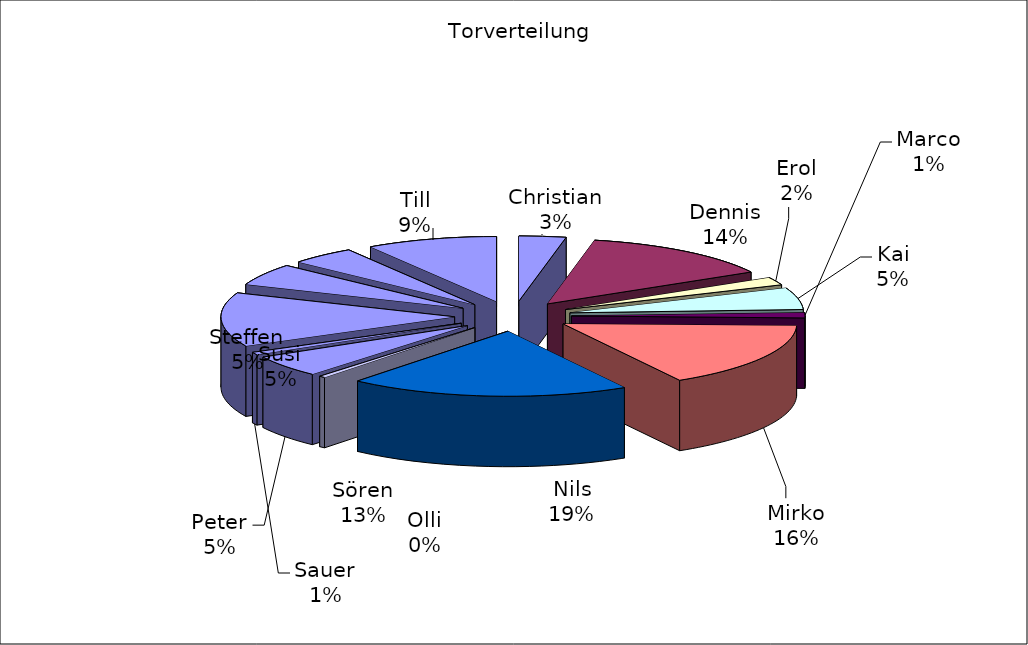
| Category | Series 0 |
|---|---|
| Christian | 15 |
| Dennis | 63 |
| Erol | 9 |
| Kai | 25 |
| Marco | 6 |
| Mirko | 75 |
| Nils | 90 |
| Olli | 2 |
| Peter | 25 |
| Sauer | 3 |
| Sören | 62 |
| Steffen | 25 |
| Susi | 21 |
| Till | 42 |